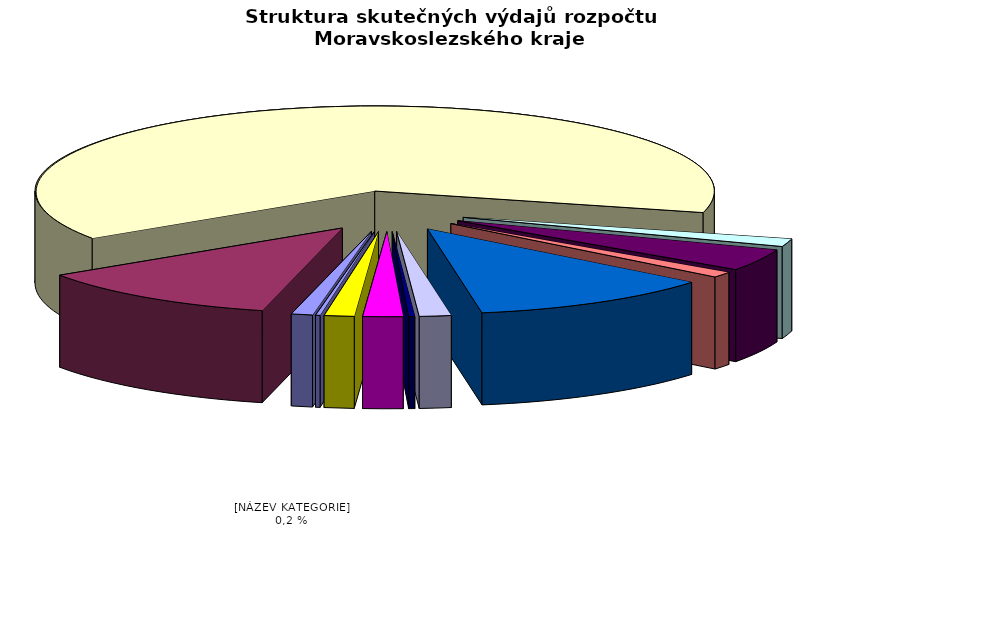
| Category | Series 0 |
|---|---|
| Regionální rozvoj | 352193.481 |
| Doprava | 4108422.882 |
| Školství | 22005871.477 |
| Kultura | 516684.384 |
| Zdravotnictví | 1446796.942 |
| Životní prostředí | 371311.859 |
| Sociální věci | 4028365.355 |
| Krizové řízení | 524021.404 |
| Cestovní ruch | 99905.591 |
| Všeobecná veřejná správa a služby | 661630.771 |
| Ostatní | 493809.545 |
| Chytrý region | 74902.657 |